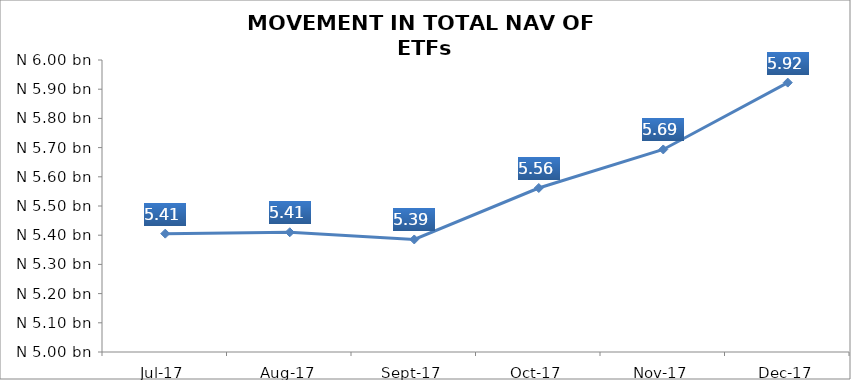
| Category | Series 0 |
|---|---|
| 2017-07-01 | 5405312682.53 |
| 2017-08-01 | 5410071931.29 |
| 2017-09-01 | 5385378575.54 |
| 2017-10-01 | 5561634501.26 |
| 2017-11-01 | 5693600846.84 |
| 2017-12-01 | 5922585158.84 |